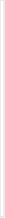
| Category | Series 0 |
|---|---|
| 0 | 1 |
| 1 | 3 |
| 2 | 3 |
| 3 | 1 |
| 4 | 1 |
| 5 | 2 |
| 6 | 1 |
| 7 | 1 |
| 8 | 1 |